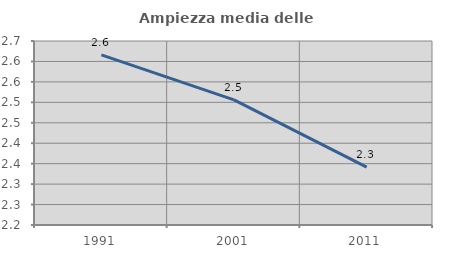
| Category | Ampiezza media delle famiglie |
|---|---|
| 1991.0 | 2.616 |
| 2001.0 | 2.506 |
| 2011.0 | 2.342 |